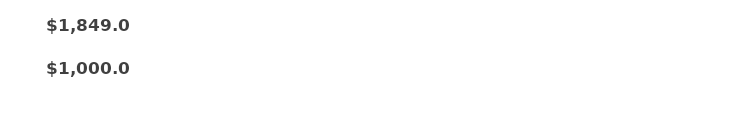
| Category | TOTAL PROJECT BUDGET | TOTAL ACTUAL |
|---|---|---|
| 0 | 1000 | 1849 |